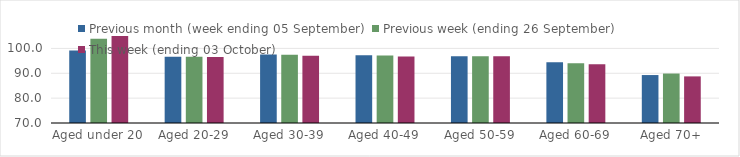
| Category | Previous month (week ending 05 September) | Previous week (ending 26 September) | This week (ending 03 October) |
|---|---|---|---|
| Aged under 20 | 99.19 | 103.87 | 105.19 |
| Aged 20-29 | 96.63 | 96.61 | 96.6 |
| Aged 30-39 | 97.6 | 97.5 | 97.06 |
| Aged 40-49 | 97.24 | 97.15 | 96.72 |
| Aged 50-59 | 96.87 | 96.84 | 96.88 |
| Aged 60-69 | 94.46 | 94.07 | 93.63 |
| Aged 70+ | 89.29 | 89.9 | 88.75 |